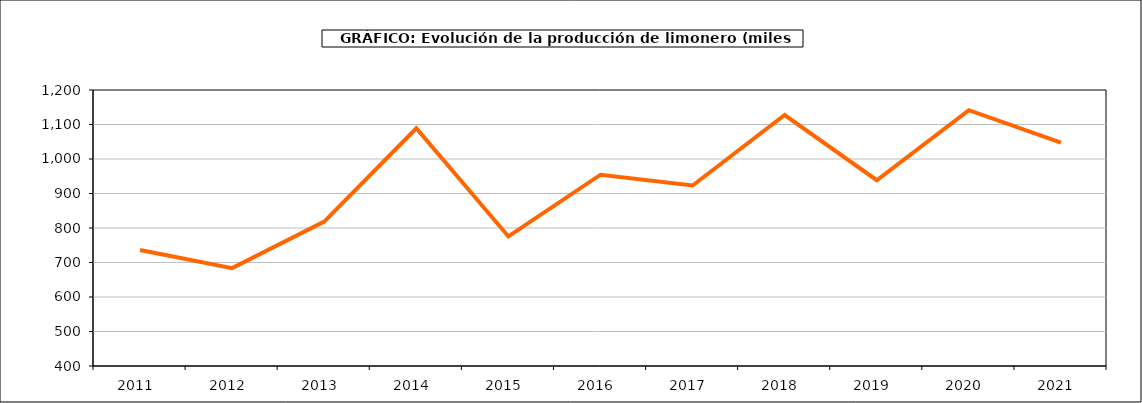
| Category | producción |
|---|---|
| 2011.0 | 736.198 |
| 2012.0 | 683.604 |
| 2013.0 | 818.489 |
| 2014.0 | 1088.964 |
| 2015.0 | 775.546 |
| 2016.0 | 954.479 |
| 2017.0 | 923.192 |
| 2018.0 | 1127.509 |
| 2019.0 | 938.42 |
| 2020.0 | 1141.574 |
| 2021.0 | 1047.323 |